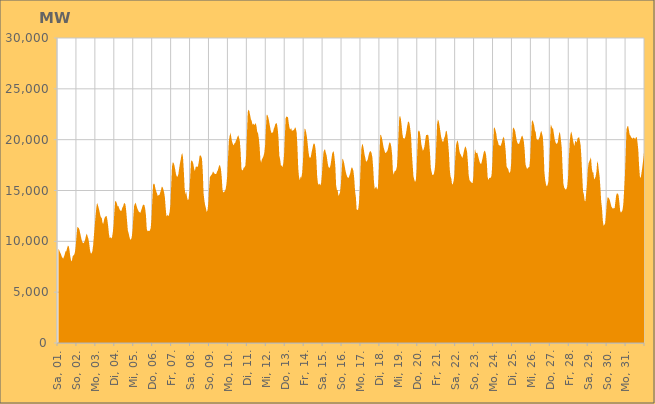
| Category | Series 0 |
|---|---|
|  Sa, 01.  | 9297.243 |
|  Sa, 01.  | 9127.377 |
|  Sa, 01.  | 8927.856 |
|  Sa, 01.  | 8781.903 |
|  Sa, 01.  | 8542.84 |
|  Sa, 01.  | 8406.448 |
|  Sa, 01.  | 8294.907 |
|  Sa, 01.  | 8480.545 |
|  Sa, 01.  | 8699.142 |
|  Sa, 01.  | 9034.923 |
|  Sa, 01.  | 9000.506 |
|  Sa, 01.  | 9331.084 |
|  Sa, 01.  | 9569.949 |
|  Sa, 01.  | 9541.004 |
|  Sa, 01.  | 9165.156 |
|  Sa, 01.  | 8547.652 |
|  Sa, 01.  | 8151.195 |
|  So, 02.  | 8013.837 |
|  So, 02.  | 8501.731 |
|  So, 02.  | 8618.587 |
|  So, 02.  | 8686.888 |
|  So, 02.  | 8943.568 |
|  So, 02.  | 9563.142 |
|  So, 02.  | 10558.52 |
|  So, 02.  | 11411.573 |
|  So, 02.  | 11367.869 |
|  So, 02.  | 11286.131 |
|  So, 02.  | 11040.961 |
|  So, 02.  | 10656.538 |
|  So, 02.  | 10302.47 |
|  So, 02.  | 10003.154 |
|  So, 02.  | 9847.712 |
|  So, 02.  | 9817.856 |
|  So, 02.  | 9978.317 |
|  So, 02.  | 10219.112 |
|  So, 02.  | 10555.624 |
|  So, 02.  | 10774.242 |
|  So, 02.  | 10492.299 |
|  So, 02.  | 10253.709 |
|  So, 02.  | 9823.09 |
|  So, 02.  | 9154.968 |
|  Mo, 03.  | 8828.816 |
|  Mo, 03.  | 8806.626 |
|  Mo, 03.  | 9013.79 |
|  Mo, 03.  | 9576.559 |
|  Mo, 03.  | 10555.213 |
|  Mo, 03.  | 11451.764 |
|  Mo, 03.  | 12420.045 |
|  Mo, 03.  | 13246.559 |
|  Mo, 03.  | 13779.607 |
|  Mo, 03.  | 13584 |
|  Mo, 03.  | 13306.664 |
|  Mo, 03.  | 13000.279 |
|  Mo, 03.  | 12587.063 |
|  Mo, 03.  | 12358.332 |
|  Mo, 03.  | 12299.291 |
|  Mo, 03.  | 11772.175 |
|  Mo, 03.  | 11759.184 |
|  Mo, 03.  | 12167.514 |
|  Mo, 03.  | 12394.853 |
|  Mo, 03.  | 12453.781 |
|  Mo, 03.  | 12506.398 |
|  Mo, 03.  | 12159.607 |
|  Mo, 03.  | 11563.159 |
|  Mo, 03.  | 10772.917 |
|  Di, 04.  | 10312.886 |
|  Di, 04.  | 10405.996 |
|  Di, 04.  | 10283.813 |
|  Di, 04.  | 10400.986 |
|  Di, 04.  | 10906.482 |
|  Di, 04.  | 11686.043 |
|  Di, 04.  | 12940.377 |
|  Di, 04.  | 13968.365 |
|  Di, 04.  | 13944.195 |
|  Di, 04.  | 13763.728 |
|  Di, 04.  | 13448.785 |
|  Di, 04.  | 13481.313 |
|  Di, 04.  | 13255.58 |
|  Di, 04.  | 13075.744 |
|  Di, 04.  | 12999.113 |
|  Di, 04.  | 13012.467 |
|  Di, 04.  | 13307.242 |
|  Di, 04.  | 13439.864 |
|  Di, 04.  | 13697.597 |
|  Di, 04.  | 13779.482 |
|  Di, 04.  | 13615.321 |
|  Di, 04.  | 12968.152 |
|  Di, 04.  | 12040.893 |
|  Di, 04.  | 11072.305 |
|  Mi, 05.  | 10809.786 |
|  Mi, 05.  | 10443.861 |
|  Mi, 05.  | 10181.352 |
|  Mi, 05.  | 10193.484 |
|  Mi, 05.  | 10421.703 |
|  Mi, 05.  | 11133.392 |
|  Mi, 05.  | 12405.032 |
|  Mi, 05.  | 13491.157 |
|  Mi, 05.  | 13690.147 |
|  Mi, 05.  | 13805.144 |
|  Mi, 05.  | 13515.508 |
|  Mi, 05.  | 13249.353 |
|  Mi, 05.  | 13061.247 |
|  Mi, 05.  | 12904.88 |
|  Mi, 05.  | 12859.362 |
|  Mi, 05.  | 12809.925 |
|  Mi, 05.  | 13067.753 |
|  Mi, 05.  | 13310.866 |
|  Mi, 05.  | 13549.159 |
|  Mi, 05.  | 13631.902 |
|  Mi, 05.  | 13562.806 |
|  Mi, 05.  | 13213.504 |
|  Mi, 05.  | 12551.069 |
|  Mi, 05.  | 11222.497 |
|  Do, 06.  | 10978.981 |
|  Do, 06.  | 11046.501 |
|  Do, 06.  | 11015.824 |
|  Do, 06.  | 11071.483 |
|  Do, 06.  | 11306.115 |
|  Do, 06.  | 12226.282 |
|  Do, 06.  | 13999.785 |
|  Do, 06.  | 15559.274 |
|  Do, 06.  | 15686.807 |
|  Do, 06.  | 15598.939 |
|  Do, 06.  | 15193.51 |
|  Do, 06.  | 14918.974 |
|  Do, 06.  | 14709.607 |
|  Do, 06.  | 14456.285 |
|  Do, 06.  | 14545.791 |
|  Do, 06.  | 14568.469 |
|  Do, 06.  | 14780.06 |
|  Do, 06.  | 15039.278 |
|  Do, 06.  | 15372.292 |
|  Do, 06.  | 15342.751 |
|  Do, 06.  | 15109.462 |
|  Do, 06.  | 14815.173 |
|  Do, 06.  | 14295.491 |
|  Do, 06.  | 13235.201 |
|  Fr, 07.  | 12432.137 |
|  Fr, 07.  | 12623.3 |
|  Fr, 07.  | 12487.171 |
|  Fr, 07.  | 12541.734 |
|  Fr, 07.  | 12904.231 |
|  Fr, 07.  | 13623.397 |
|  Fr, 07.  | 15531.365 |
|  Fr, 07.  | 17363.732 |
|  Fr, 07.  | 17799.169 |
|  Fr, 07.  | 17708.736 |
|  Fr, 07.  | 17495.717 |
|  Fr, 07.  | 17084.337 |
|  Fr, 07.  | 16620.86 |
|  Fr, 07.  | 16396.358 |
|  Fr, 07.  | 16337.735 |
|  Fr, 07.  | 16587.449 |
|  Fr, 07.  | 17131.82 |
|  Fr, 07.  | 17641.072 |
|  Fr, 07.  | 18039.321 |
|  Fr, 07.  | 18498.307 |
|  Fr, 07.  | 18687.438 |
|  Fr, 07.  | 18232.067 |
|  Fr, 07.  | 16869.359 |
|  Fr, 07.  | 15249.272 |
|  Sa, 08.  | 14603.294 |
|  Sa, 08.  | 14904.948 |
|  Sa, 08.  | 14347.56 |
|  Sa, 08.  | 14046.243 |
|  Sa, 08.  | 14145.37 |
|  Sa, 08.  | 14845.134 |
|  Sa, 08.  | 16196.352 |
|  Sa, 08.  | 17860.541 |
|  Sa, 08.  | 17957.769 |
|  Sa, 08.  | 17862.536 |
|  Sa, 08.  | 17637.864 |
|  Sa, 08.  | 17140.004 |
|  Sa, 08.  | 16918.288 |
|  Sa, 08.  | 17314.839 |
|  Sa, 08.  | 17371.565 |
|  Sa, 08.  | 17306.217 |
|  Sa, 08.  | 17408.926 |
|  Sa, 08.  | 17852.42 |
|  Sa, 08.  | 18408.787 |
|  Sa, 08.  | 18459.908 |
|  Sa, 08.  | 18351.8 |
|  Sa, 08.  | 18119.713 |
|  Sa, 08.  | 16888.329 |
|  Sa, 08.  | 14733.706 |
|  So, 09.  | 14041.661 |
|  So, 09.  | 13553.918 |
|  So, 09.  | 13255.131 |
|  So, 09.  | 12883.224 |
|  So, 09.  | 13058.569 |
|  So, 09.  | 13751.037 |
|  So, 09.  | 15192.559 |
|  So, 09.  | 16304.567 |
|  So, 09.  | 16439.363 |
|  So, 09.  | 16538.337 |
|  So, 09.  | 16653.419 |
|  So, 09.  | 16891.793 |
|  So, 09.  | 16752.202 |
|  So, 09.  | 16650.463 |
|  So, 09.  | 16621.831 |
|  So, 09.  | 16633.222 |
|  So, 09.  | 16832.36 |
|  So, 09.  | 16979.248 |
|  So, 09.  | 17264.377 |
|  So, 09.  | 17515.491 |
|  So, 09.  | 17428.074 |
|  So, 09.  | 17131.083 |
|  So, 09.  | 16349.365 |
|  So, 09.  | 15057.428 |
|  Mo, 10.  | 14796.765 |
|  Mo, 10.  | 14868.657 |
|  Mo, 10.  | 14926.004 |
|  Mo, 10.  | 15165.22 |
|  Mo, 10.  | 15618.171 |
|  Mo, 10.  | 16453.242 |
|  Mo, 10.  | 18213.348 |
|  Mo, 10.  | 19832.551 |
|  Mo, 10.  | 20338.282 |
|  Mo, 10.  | 20687.489 |
|  Mo, 10.  | 20307.249 |
|  Mo, 10.  | 19834.882 |
|  Mo, 10.  | 19598.029 |
|  Mo, 10.  | 19426.366 |
|  Mo, 10.  | 19608.562 |
|  Mo, 10.  | 19683.506 |
|  Mo, 10.  | 19897.702 |
|  Mo, 10.  | 20053.561 |
|  Mo, 10.  | 20285.571 |
|  Mo, 10.  | 20433.517 |
|  Mo, 10.  | 20188.028 |
|  Mo, 10.  | 19850.654 |
|  Mo, 10.  | 18775.941 |
|  Mo, 10.  | 17126.831 |
|  Di, 11.  | 16970.623 |
|  Di, 11.  | 17024.589 |
|  Di, 11.  | 17263.063 |
|  Di, 11.  | 17285.534 |
|  Di, 11.  | 17459.201 |
|  Di, 11.  | 18381.237 |
|  Di, 11.  | 20527.283 |
|  Di, 11.  | 22709.491 |
|  Di, 11.  | 22967.289 |
|  Di, 11.  | 22816.02 |
|  Di, 11.  | 22399.847 |
|  Di, 11.  | 22006.098 |
|  Di, 11.  | 21860.525 |
|  Di, 11.  | 21459.226 |
|  Di, 11.  | 21589.8 |
|  Di, 11.  | 21458.461 |
|  Di, 11.  | 21477.467 |
|  Di, 11.  | 21636.772 |
|  Di, 11.  | 21363.62 |
|  Di, 11.  | 20774.185 |
|  Di, 11.  | 20642.727 |
|  Di, 11.  | 20170.771 |
|  Di, 11.  | 19344.483 |
|  Di, 11.  | 18038.023 |
|  Mi, 12.  | 17752.61 |
|  Mi, 12.  | 18075.556 |
|  Mi, 12.  | 18206.141 |
|  Mi, 12.  | 18394.067 |
|  Mi, 12.  | 18708.539 |
|  Mi, 12.  | 19439.543 |
|  Mi, 12.  | 21091.506 |
|  Mi, 12.  | 22473.925 |
|  Mi, 12.  | 22414.535 |
|  Mi, 12.  | 22201.395 |
|  Mi, 12.  | 21824.63 |
|  Mi, 12.  | 21375.103 |
|  Mi, 12.  | 20955.126 |
|  Mi, 12.  | 20657.079 |
|  Mi, 12.  | 20684.098 |
|  Mi, 12.  | 20729.239 |
|  Mi, 12.  | 21069.085 |
|  Mi, 12.  | 21272.403 |
|  Mi, 12.  | 21532.637 |
|  Mi, 12.  | 21635.153 |
|  Mi, 12.  | 21555.762 |
|  Mi, 12.  | 21038.609 |
|  Mi, 12.  | 20119.735 |
|  Mi, 12.  | 18427.61 |
|  Do, 13.  | 18082.774 |
|  Do, 13.  | 17480.276 |
|  Do, 13.  | 17446.996 |
|  Do, 13.  | 17302.725 |
|  Do, 13.  | 17626.438 |
|  Do, 13.  | 18460.119 |
|  Do, 13.  | 20225.966 |
|  Do, 13.  | 22099.543 |
|  Do, 13.  | 22293.26 |
|  Do, 13.  | 22245.417 |
|  Do, 13.  | 22208.862 |
|  Do, 13.  | 21589.421 |
|  Do, 13.  | 21129.616 |
|  Do, 13.  | 20985.463 |
|  Do, 13.  | 21150.297 |
|  Do, 13.  | 20848.541 |
|  Do, 13.  | 20915.764 |
|  Do, 13.  | 20926.272 |
|  Do, 13.  | 21014.774 |
|  Do, 13.  | 21234.533 |
|  Do, 13.  | 21089.12 |
|  Do, 13.  | 20680.335 |
|  Do, 13.  | 19250.649 |
|  Do, 13.  | 17178.915 |
|  Fr, 14.  | 16306.738 |
|  Fr, 14.  | 16005.281 |
|  Fr, 14.  | 16362.457 |
|  Fr, 14.  | 16273.343 |
|  Fr, 14.  | 16760.597 |
|  Fr, 14.  | 17880.44 |
|  Fr, 14.  | 19693.761 |
|  Fr, 14.  | 21077.52 |
|  Fr, 14.  | 21038.466 |
|  Fr, 14.  | 20730.033 |
|  Fr, 14.  | 20268.7 |
|  Fr, 14.  | 19573.884 |
|  Fr, 14.  | 18792.012 |
|  Fr, 14.  | 18303.591 |
|  Fr, 14.  | 18193.757 |
|  Fr, 14.  | 18339.439 |
|  Fr, 14.  | 18786.006 |
|  Fr, 14.  | 19146.693 |
|  Fr, 14.  | 19529.46 |
|  Fr, 14.  | 19646.167 |
|  Fr, 14.  | 19535.476 |
|  Fr, 14.  | 19060.005 |
|  Fr, 14.  | 18041.675 |
|  Fr, 14.  | 16382.517 |
|  Sa, 15.  | 15680.74 |
|  Sa, 15.  | 15576.18 |
|  Sa, 15.  | 15675.353 |
|  Sa, 15.  | 15494.663 |
|  Sa, 15.  | 15754.814 |
|  Sa, 15.  | 16568.443 |
|  Sa, 15.  | 17809.295 |
|  Sa, 15.  | 18769.909 |
|  Sa, 15.  | 19016.683 |
|  Sa, 15.  | 19036.354 |
|  Sa, 15.  | 18685.517 |
|  Sa, 15.  | 18445.328 |
|  Sa, 15.  | 17865.205 |
|  Sa, 15.  | 17394.316 |
|  Sa, 15.  | 17226.956 |
|  Sa, 15.  | 17248.553 |
|  Sa, 15.  | 17540.584 |
|  Sa, 15.  | 18064.155 |
|  Sa, 15.  | 18628.425 |
|  Sa, 15.  | 18818.742 |
|  Sa, 15.  | 18845.496 |
|  Sa, 15.  | 18249.637 |
|  Sa, 15.  | 17430.997 |
|  Sa, 15.  | 15519.957 |
|  So, 16.  | 15064.557 |
|  So, 16.  | 15021.32 |
|  So, 16.  | 14453.952 |
|  So, 16.  | 14620.822 |
|  So, 16.  | 14839.09 |
|  So, 16.  | 15599.248 |
|  So, 16.  | 16862.141 |
|  So, 16.  | 18156.148 |
|  So, 16.  | 18023.742 |
|  So, 16.  | 17765.241 |
|  So, 16.  | 17342.955 |
|  So, 16.  | 16910.254 |
|  So, 16.  | 16605.962 |
|  So, 16.  | 16368.628 |
|  So, 16.  | 16240.827 |
|  So, 16.  | 16256.204 |
|  So, 16.  | 16498.943 |
|  So, 16.  | 16733.885 |
|  So, 16.  | 17124.984 |
|  So, 16.  | 17298.434 |
|  So, 16.  | 17161.741 |
|  So, 16.  | 16905.003 |
|  So, 16.  | 16157.707 |
|  So, 16.  | 14948.869 |
|  Mo, 17.  | 14387.097 |
|  Mo, 17.  | 13164.126 |
|  Mo, 17.  | 13086.426 |
|  Mo, 17.  | 13129.265 |
|  Mo, 17.  | 13804.602 |
|  Mo, 17.  | 15163.524 |
|  Mo, 17.  | 17298.718 |
|  Mo, 17.  | 19083.989 |
|  Mo, 17.  | 19574.724 |
|  Mo, 17.  | 19481.423 |
|  Mo, 17.  | 19082.518 |
|  Mo, 17.  | 18557.495 |
|  Mo, 17.  | 18208.943 |
|  Mo, 17.  | 17812.25 |
|  Mo, 17.  | 17902.003 |
|  Mo, 17.  | 18037.501 |
|  Mo, 17.  | 18407.494 |
|  Mo, 17.  | 18719.751 |
|  Mo, 17.  | 18866.409 |
|  Mo, 17.  | 18848.353 |
|  Mo, 17.  | 18670.292 |
|  Mo, 17.  | 18224.72 |
|  Mo, 17.  | 17218.648 |
|  Mo, 17.  | 15818.634 |
|  Di, 18.  | 15130.218 |
|  Di, 18.  | 15319.256 |
|  Di, 18.  | 15378.979 |
|  Di, 18.  | 15085.734 |
|  Di, 18.  | 15273.254 |
|  Di, 18.  | 16670.284 |
|  Di, 18.  | 18655.541 |
|  Di, 18.  | 20480.464 |
|  Di, 18.  | 20440.641 |
|  Di, 18.  | 20181.161 |
|  Di, 18.  | 19787.467 |
|  Di, 18.  | 19293.283 |
|  Di, 18.  | 19025.407 |
|  Di, 18.  | 18742.866 |
|  Di, 18.  | 18683.938 |
|  Di, 18.  | 18804.848 |
|  Di, 18.  | 18901.02 |
|  Di, 18.  | 19207.79 |
|  Di, 18.  | 19577.167 |
|  Di, 18.  | 19760.176 |
|  Di, 18.  | 19641.302 |
|  Di, 18.  | 19276.633 |
|  Di, 18.  | 18513.544 |
|  Di, 18.  | 16878.78 |
|  Mi, 19.  | 16548.437 |
|  Mi, 19.  | 16886.283 |
|  Mi, 19.  | 16910.943 |
|  Mi, 19.  | 17028.375 |
|  Mi, 19.  | 17329.331 |
|  Mi, 19.  | 18345.235 |
|  Mi, 19.  | 20354.597 |
|  Mi, 19.  | 22146.834 |
|  Mi, 19.  | 22360.47 |
|  Mi, 19.  | 22078.305 |
|  Mi, 19.  | 21418.491 |
|  Mi, 19.  | 20599.855 |
|  Mi, 19.  | 20145.525 |
|  Mi, 19.  | 20145.739 |
|  Mi, 19.  | 20086.063 |
|  Mi, 19.  | 20384.145 |
|  Mi, 19.  | 20814.863 |
|  Mi, 19.  | 21316.734 |
|  Mi, 19.  | 21718.696 |
|  Mi, 19.  | 21796.008 |
|  Mi, 19.  | 21598.209 |
|  Mi, 19.  | 21048.491 |
|  Mi, 19.  | 20353.999 |
|  Mi, 19.  | 18711.255 |
|  Do, 20.  | 17538.582 |
|  Do, 20.  | 16399.858 |
|  Do, 20.  | 16086.32 |
|  Do, 20.  | 15836.876 |
|  Do, 20.  | 15990.823 |
|  Do, 20.  | 16949.949 |
|  Do, 20.  | 19076.525 |
|  Do, 20.  | 20837.131 |
|  Do, 20.  | 20908.931 |
|  Do, 20.  | 20774.911 |
|  Do, 20.  | 20284.251 |
|  Do, 20.  | 19537.388 |
|  Do, 20.  | 19218.943 |
|  Do, 20.  | 18911.332 |
|  Do, 20.  | 19056.473 |
|  Do, 20.  | 19352.733 |
|  Do, 20.  | 19951.095 |
|  Do, 20.  | 20458.933 |
|  Do, 20.  | 20468.366 |
|  Do, 20.  | 20485.969 |
|  Do, 20.  | 20410.975 |
|  Do, 20.  | 19643.966 |
|  Do, 20.  | 18647.764 |
|  Do, 20.  | 17227.327 |
|  Fr, 21.  | 16829.362 |
|  Fr, 21.  | 16534.812 |
|  Fr, 21.  | 16536.478 |
|  Fr, 21.  | 16658.441 |
|  Fr, 21.  | 17099.813 |
|  Fr, 21.  | 17868.699 |
|  Fr, 21.  | 19635.383 |
|  Fr, 21.  | 21527.168 |
|  Fr, 21.  | 21987.299 |
|  Fr, 21.  | 21840.819 |
|  Fr, 21.  | 21431.832 |
|  Fr, 21.  | 20859.027 |
|  Fr, 21.  | 20325.601 |
|  Fr, 21.  | 20004.053 |
|  Fr, 21.  | 19798.696 |
|  Fr, 21.  | 19818.806 |
|  Fr, 21.  | 20165.047 |
|  Fr, 21.  | 20362.736 |
|  Fr, 21.  | 20825.701 |
|  Fr, 21.  | 20891.875 |
|  Fr, 21.  | 20446.833 |
|  Fr, 21.  | 19653.716 |
|  Fr, 21.  | 18678.347 |
|  Fr, 21.  | 17088.675 |
|  Sa, 22.  | 16380.277 |
|  Sa, 22.  | 16192.192 |
|  Sa, 22.  | 15580.402 |
|  Sa, 22.  | 15676.532 |
|  Sa, 22.  | 15979.651 |
|  Sa, 22.  | 16639.015 |
|  Sa, 22.  | 18227.742 |
|  Sa, 22.  | 19464.322 |
|  Sa, 22.  | 19790.115 |
|  Sa, 22.  | 19947.056 |
|  Sa, 22.  | 19605.565 |
|  Sa, 22.  | 19009.466 |
|  Sa, 22.  | 18656.719 |
|  Sa, 22.  | 18530.037 |
|  Sa, 22.  | 18347.86 |
|  Sa, 22.  | 18188.915 |
|  Sa, 22.  | 18487.644 |
|  Sa, 22.  | 18869.286 |
|  Sa, 22.  | 19183.281 |
|  Sa, 22.  | 19367.906 |
|  Sa, 22.  | 19132.888 |
|  Sa, 22.  | 18783.512 |
|  Sa, 22.  | 17818.943 |
|  Sa, 22.  | 16548.4 |
|  So, 23.  | 16048.436 |
|  So, 23.  | 15906.614 |
|  So, 23.  | 15846.499 |
|  So, 23.  | 15745.178 |
|  So, 23.  | 15742.1 |
|  So, 23.  | 16402.728 |
|  So, 23.  | 17949.315 |
|  So, 23.  | 19097.892 |
|  So, 23.  | 18736.208 |
|  So, 23.  | 18676.848 |
|  So, 23.  | 18717.691 |
|  So, 23.  | 18400.839 |
|  So, 23.  | 18069.48 |
|  So, 23.  | 17774.976 |
|  So, 23.  | 17640.981 |
|  So, 23.  | 17633.032 |
|  So, 23.  | 17963.66 |
|  So, 23.  | 18334.234 |
|  So, 23.  | 18716.011 |
|  So, 23.  | 18929.818 |
|  So, 23.  | 18852.874 |
|  So, 23.  | 18535.973 |
|  So, 23.  | 17778.243 |
|  So, 23.  | 16353.604 |
|  Mo, 24.  | 16029.355 |
|  Mo, 24.  | 16207.396 |
|  Mo, 24.  | 16258.573 |
|  Mo, 24.  | 16239.599 |
|  Mo, 24.  | 16495.817 |
|  Mo, 24.  | 17626.775 |
|  Mo, 24.  | 19406.683 |
|  Mo, 24.  | 21164.166 |
|  Mo, 24.  | 21196.274 |
|  Mo, 24.  | 20901.587 |
|  Mo, 24.  | 20601.737 |
|  Mo, 24.  | 20006.886 |
|  Mo, 24.  | 19833.478 |
|  Mo, 24.  | 19500.559 |
|  Mo, 24.  | 19440.358 |
|  Mo, 24.  | 19354.798 |
|  Mo, 24.  | 19477.431 |
|  Mo, 24.  | 19723.379 |
|  Mo, 24.  | 20043.903 |
|  Mo, 24.  | 20295.748 |
|  Mo, 24.  | 20145.68 |
|  Mo, 24.  | 19610.182 |
|  Mo, 24.  | 18818.064 |
|  Mo, 24.  | 17406.782 |
|  Di, 25.  | 17213.834 |
|  Di, 25.  | 17128.997 |
|  Di, 25.  | 16834.721 |
|  Di, 25.  | 16723.882 |
|  Di, 25.  | 16919.741 |
|  Di, 25.  | 17792.12 |
|  Di, 25.  | 19705.674 |
|  Di, 25.  | 21074.163 |
|  Di, 25.  | 21206.385 |
|  Di, 25.  | 21034.329 |
|  Di, 25.  | 20830.392 |
|  Di, 25.  | 20319.961 |
|  Di, 25.  | 19897.651 |
|  Di, 25.  | 19661.363 |
|  Di, 25.  | 19583.428 |
|  Di, 25.  | 19602.152 |
|  Di, 25.  | 19877.411 |
|  Di, 25.  | 20058.376 |
|  Di, 25.  | 20321.672 |
|  Di, 25.  | 20408.364 |
|  Di, 25.  | 20176.063 |
|  Di, 25.  | 19779.714 |
|  Di, 25.  | 18947.58 |
|  Di, 25.  | 17583.464 |
|  Mi, 26.  | 17322.16 |
|  Mi, 26.  | 17130.959 |
|  Mi, 26.  | 17183.292 |
|  Mi, 26.  | 17283.064 |
|  Mi, 26.  | 17346.096 |
|  Mi, 26.  | 18208.316 |
|  Mi, 26.  | 20078.863 |
|  Mi, 26.  | 21731.627 |
|  Mi, 26.  | 21921.69 |
|  Mi, 26.  | 21694.302 |
|  Mi, 26.  | 21421.4 |
|  Mi, 26.  | 20879.184 |
|  Mi, 26.  | 20724.233 |
|  Mi, 26.  | 20072.868 |
|  Mi, 26.  | 19988.597 |
|  Mi, 26.  | 19942.839 |
|  Mi, 26.  | 20096.085 |
|  Mi, 26.  | 20300.386 |
|  Mi, 26.  | 20658.616 |
|  Mi, 26.  | 20885.223 |
|  Mi, 26.  | 20605.606 |
|  Mi, 26.  | 20287.029 |
|  Mi, 26.  | 19030.732 |
|  Mi, 26.  | 16802.917 |
|  Do, 27.  | 16047.334 |
|  Do, 27.  | 15607.362 |
|  Do, 27.  | 15399.14 |
|  Do, 27.  | 15534.612 |
|  Do, 27.  | 15840.46 |
|  Do, 27.  | 17246.783 |
|  Do, 27.  | 19334.21 |
|  Do, 27.  | 21517.367 |
|  Do, 27.  | 21332.645 |
|  Do, 27.  | 21121.171 |
|  Do, 27.  | 21092.81 |
|  Do, 27.  | 20573.022 |
|  Do, 27.  | 20045.868 |
|  Do, 27.  | 19773.118 |
|  Do, 27.  | 19585.258 |
|  Do, 27.  | 19615.833 |
|  Do, 27.  | 19750.358 |
|  Do, 27.  | 20310.696 |
|  Do, 27.  | 20754.02 |
|  Do, 27.  | 20580.022 |
|  Do, 27.  | 19915.948 |
|  Do, 27.  | 19170.445 |
|  Do, 27.  | 17263.906 |
|  Do, 27.  | 15702.636 |
|  Fr, 28.  | 15304.209 |
|  Fr, 28.  | 15180.959 |
|  Fr, 28.  | 15077.305 |
|  Fr, 28.  | 15168.172 |
|  Fr, 28.  | 15431.009 |
|  Fr, 28.  | 16304.458 |
|  Fr, 28.  | 18173.644 |
|  Fr, 28.  | 19736.179 |
|  Fr, 28.  | 20509.263 |
|  Fr, 28.  | 20813.516 |
|  Fr, 28.  | 20503.617 |
|  Fr, 28.  | 20077.787 |
|  Fr, 28.  | 19645.704 |
|  Fr, 28.  | 19384.064 |
|  Fr, 28.  | 19843.489 |
|  Fr, 28.  | 19873.753 |
|  Fr, 28.  | 19699.271 |
|  Fr, 28.  | 20144.65 |
|  Fr, 28.  | 20197.459 |
|  Fr, 28.  | 20239.766 |
|  Fr, 28.  | 19874.533 |
|  Fr, 28.  | 19398.723 |
|  Fr, 28.  | 18132.83 |
|  Fr, 28.  | 16365.33 |
|  Sa, 29.  | 14870.241 |
|  Sa, 29.  | 14631.923 |
|  Sa, 29.  | 14006.58 |
|  Sa, 29.  | 13950.542 |
|  Sa, 29.  | 14799.735 |
|  Sa, 29.  | 15663.532 |
|  Sa, 29.  | 17067.984 |
|  Sa, 29.  | 17695.332 |
|  Sa, 29.  | 17878.581 |
|  Sa, 29.  | 18056.48 |
|  Sa, 29.  | 18258.257 |
|  Sa, 29.  | 17254.357 |
|  Sa, 29.  | 16765.834 |
|  Sa, 29.  | 16809.864 |
|  Sa, 29.  | 16092.911 |
|  Sa, 29.  | 16199.257 |
|  Sa, 29.  | 16396.129 |
|  Sa, 29.  | 16881.34 |
|  Sa, 29.  | 17913.932 |
|  Sa, 29.  | 17639.413 |
|  Sa, 29.  | 16965.221 |
|  Sa, 29.  | 16352.88 |
|  Sa, 29.  | 15242.331 |
|  Sa, 29.  | 13906.148 |
|  So, 30.  | 13252.384 |
|  So, 30.  | 12044.795 |
|  So, 30.  | 11533.733 |
|  So, 30.  | 11630.7 |
|  So, 30.  | 11778.832 |
|  So, 30.  | 12601.628 |
|  So, 30.  | 13674.84 |
|  So, 30.  | 14326.756 |
|  So, 30.  | 14307.966 |
|  So, 30.  | 14206.207 |
|  So, 30.  | 14015.504 |
|  So, 30.  | 13687.937 |
|  So, 30.  | 13397.21 |
|  So, 30.  | 13299.068 |
|  So, 30.  | 13179.967 |
|  So, 30.  | 13302.696 |
|  So, 30.  | 13254.955 |
|  So, 30.  | 13890.225 |
|  So, 30.  | 14555.491 |
|  So, 30.  | 14716.43 |
|  So, 30.  | 14697.777 |
|  So, 30.  | 14534.569 |
|  So, 30.  | 13834.667 |
|  So, 30.  | 13025.855 |
|  Mo, 31.  | 12811.219 |
|  Mo, 31.  | 12932.74 |
|  Mo, 31.  | 13061.527 |
|  Mo, 31.  | 13661.24 |
|  Mo, 31.  | 14954.793 |
|  Mo, 31.  | 16397.359 |
|  Mo, 31.  | 18494.652 |
|  Mo, 31.  | 20993.614 |
|  Mo, 31.  | 21269.167 |
|  Mo, 31.  | 21374.131 |
|  Mo, 31.  | 21017.811 |
|  Mo, 31.  | 20517.223 |
|  Mo, 31.  | 20402.175 |
|  Mo, 31.  | 20222.107 |
|  Mo, 31.  | 20147.534 |
|  Mo, 31.  | 20102.507 |
|  Mo, 31.  | 20214.517 |
|  Mo, 31.  | 20153.832 |
|  Mo, 31.  | 20040.318 |
|  Mo, 31.  | 20237.453 |
|  Mo, 31.  | 20269.183 |
|  Mo, 31.  | 19731.343 |
|  Mo, 31.  | 18972.586 |
|  Mo, 31.  | 17438.462 |
|  Di, 01.  | 16391.384 |
|  Di, 01.  | 16212.259 |
|  Di, 01.  | 16701.073 |
|  Di, 01.  | 17243.6 |
|  Di, 01.  | 17862.694 |
|  Di, 01.  | 18521.976 |